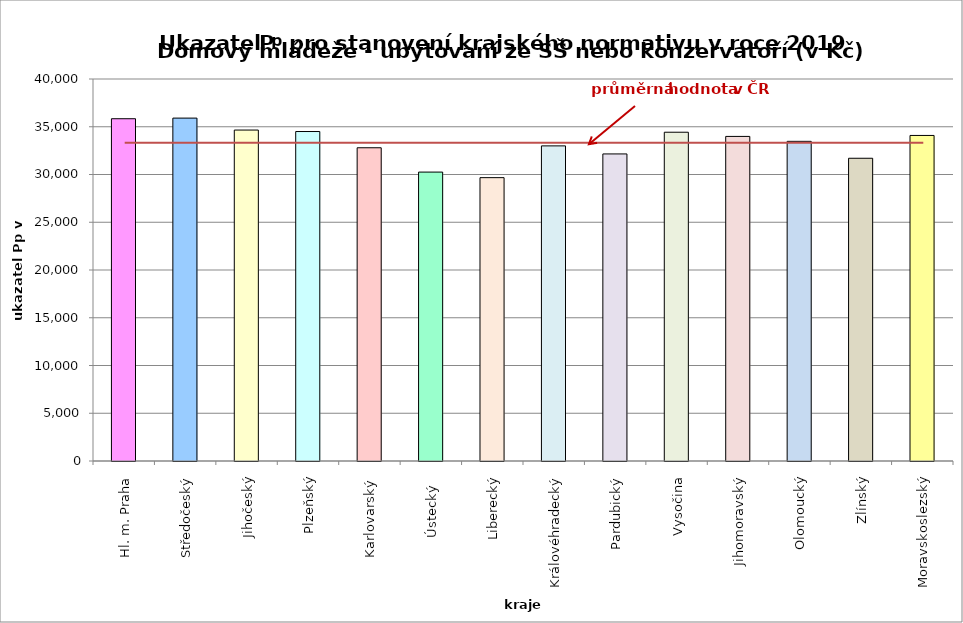
| Category | Series 0 |
|---|---|
| Hl. m. Praha | 35840 |
| Středočeský | 35905 |
| Jihočeský | 34654 |
| Plzeňský | 34500 |
| Karlovarský  | 32800 |
| Ústecký   | 30253 |
| Liberecký | 29670 |
| Královéhradecký | 32996 |
| Pardubický | 32154 |
| Vysočina | 34427 |
| Jihomoravský | 33988 |
| Olomoucký | 33472 |
| Zlínský | 31700 |
| Moravskoslezský | 34090 |